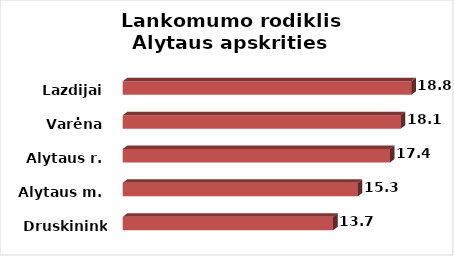
| Category | Series 0 |
|---|---|
| Druskininkai | 13.7 |
| Alytaus m. | 15.3 |
| Alytaus r. | 17.4 |
| Varėna | 18.1 |
| Lazdijai | 18.8 |